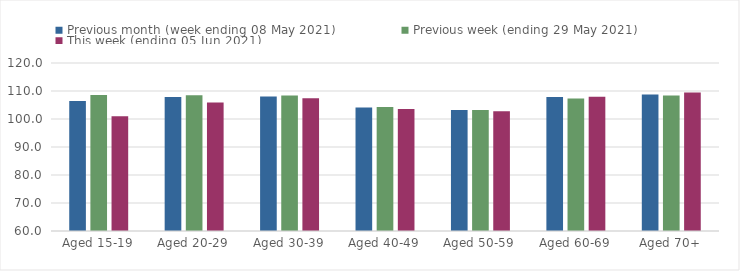
| Category | Previous month (week ending 08 May 2021) | Previous week (ending 29 May 2021) | This week (ending 05 Jun 2021) |
|---|---|---|---|
| Aged 15-19 | 106.43 | 108.55 | 100.96 |
| Aged 20-29 | 107.9 | 108.45 | 105.89 |
| Aged 30-39 | 108.08 | 108.41 | 107.41 |
| Aged 40-49 | 104.12 | 104.28 | 103.56 |
| Aged 50-59 | 103.25 | 103.17 | 102.81 |
| Aged 60-69 | 107.83 | 107.32 | 107.94 |
| Aged 70+ | 108.77 | 108.4 | 109.42 |